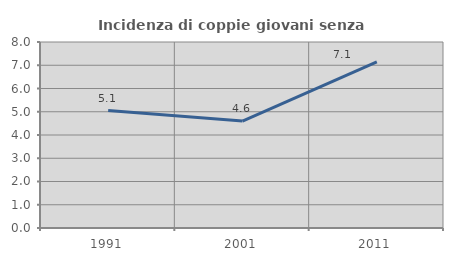
| Category | Incidenza di coppie giovani senza figli |
|---|---|
| 1991.0 | 5.051 |
| 2001.0 | 4.598 |
| 2011.0 | 7.143 |